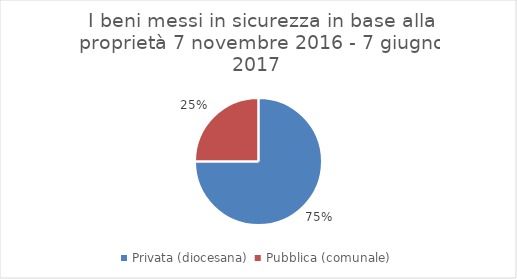
| Category | Series 0 |
|---|---|
| Privata (diocesana)  | 0.75 |
| Pubblica (comunale)  | 0.25 |